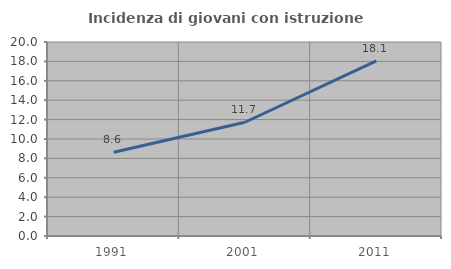
| Category | Incidenza di giovani con istruzione universitaria |
|---|---|
| 1991.0 | 8.641 |
| 2001.0 | 11.727 |
| 2011.0 | 18.052 |